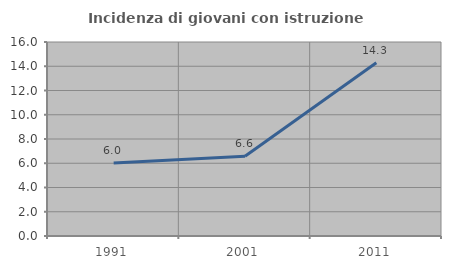
| Category | Incidenza di giovani con istruzione universitaria |
|---|---|
| 1991.0 | 6.015 |
| 2001.0 | 6.579 |
| 2011.0 | 14.286 |